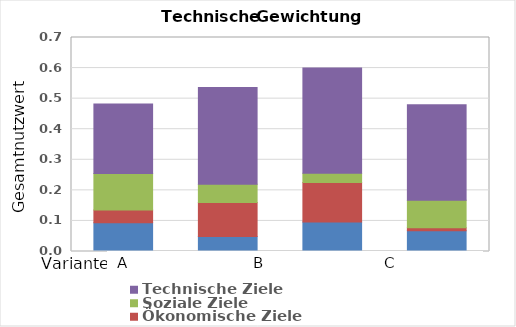
| Category | Umwelt- und Ressourcenschutz | Ökonomische Ziele | Soziale Ziele | Technische Ziele |
|---|---|---|---|---|
| 0 | 0.094 | 0.041 | 0.12 | 0.227 |
| 1 | 0.049 | 0.111 | 0.06 | 0.316 |
| 2 | 0.097 | 0.129 | 0.03 | 0.344 |
| 3 | 0.068 | 0.01 | 0.09 | 0.312 |